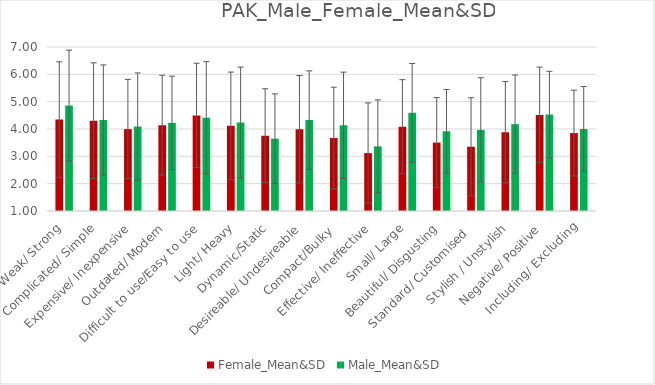
| Category | Female_Mean&SD | Male_Mean&SD |
|---|---|---|
| Weak/ Strong | 4.344 | 4.859 |
| Complicated/ Simple | 4.304 | 4.328 |
| Expensive/ Inexpensive | 3.996 | 4.091 |
| Outdated/ Modern | 4.141 | 4.225 |
| Difficult to use/Easy to use | 4.498 | 4.409 |
| Light/ Heavy | 4.115 | 4.241 |
| Dynamic/Static | 3.753 | 3.647 |
| Desireable/ Undesireable | 3.991 | 4.325 |
| Compact/Bulky  | 3.67 | 4.138 |
| Effective/ Ineffective | 3.119 | 3.366 |
| Small/ Large | 4.084 | 4.591 |
| Beautiful/ Disgusting | 3.502 | 3.919 |
| Standard/ Customised   | 3.352 | 3.969 |
| Stylish / Unstylish | 3.881 | 4.178 |
| Negative/ Positive | 4.515 | 4.528 |
| Including/ Excluding | 3.85 | 4 |